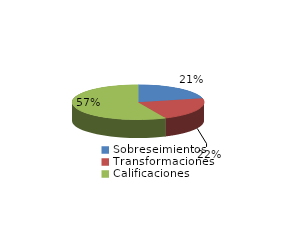
| Category | Series 0 |
|---|---|
| Sobreseimientos | 408 |
| Transformaciones | 416 |
| Calificaciones | 1084 |